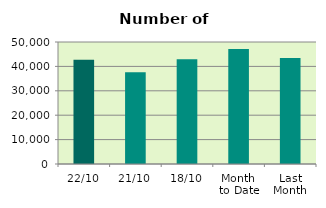
| Category | Series 0 |
|---|---|
| 22/10 | 42690 |
| 21/10 | 37642 |
| 18/10 | 42896 |
| Month 
to Date | 47117.75 |
| Last
Month | 43452.667 |